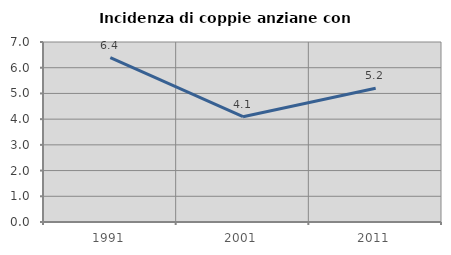
| Category | Incidenza di coppie anziane con figli |
|---|---|
| 1991.0 | 6.395 |
| 2001.0 | 4.094 |
| 2011.0 | 5.202 |